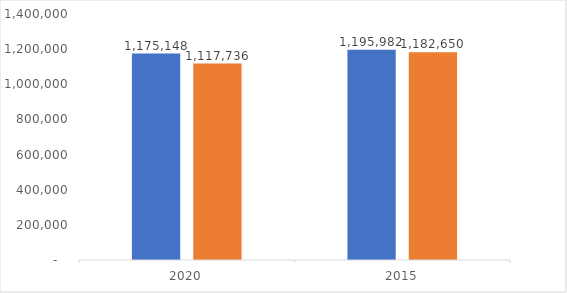
| Category | Male | Female |
|---|---|---|
| 2020.0 | 1175148 | 1117736 |
| 2015.0 | 1195982 | 1182650 |